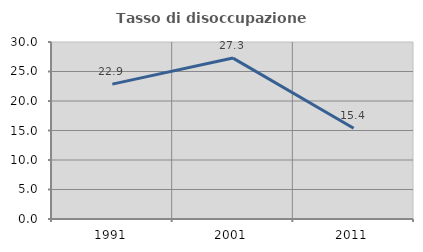
| Category | Tasso di disoccupazione giovanile  |
|---|---|
| 1991.0 | 22.857 |
| 2001.0 | 27.273 |
| 2011.0 | 15.385 |